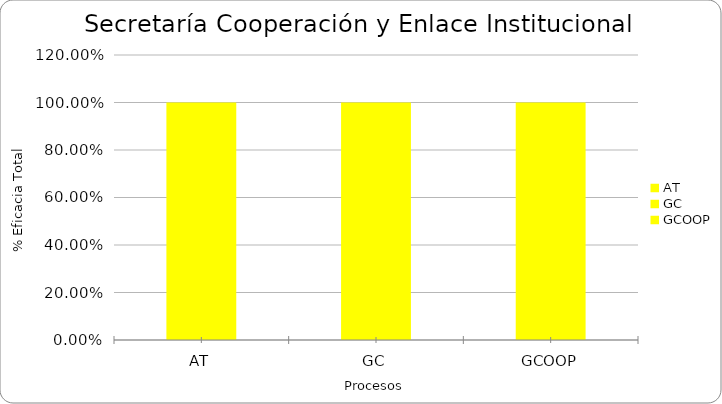
| Category | % Eficacia total |
|---|---|
| AT | 1 |
| GC | 1 |
| GCOOP | 1 |